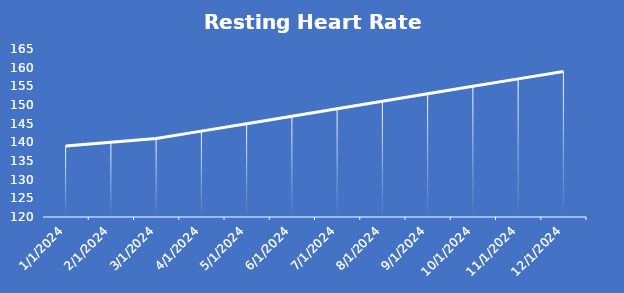
| Category | Resting Heart Rate Reserve |
|---|---|
| 1/2/24 | 139 |
| 2/2/24 | 140 |
| 3/2/24 | 141 |
| 4/2/24 | 143 |
| 5/2/24 | 145 |
| 6/2/24 | 147 |
| 7/2/24 | 149 |
| 8/2/24 | 151 |
| 9/2/24 | 153 |
| 10/2/24 | 155 |
| 11/2/24 | 157 |
| 12/2/24 | 159 |